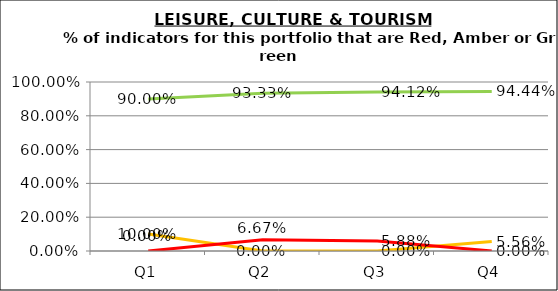
| Category | Green | Amber | Red |
|---|---|---|---|
| Q1 | 0.9 | 0.1 | 0 |
| Q2 | 0.933 | 0 | 0.067 |
| Q3 | 0.941 | 0 | 0.059 |
| Q4 | 0.944 | 0.056 | 0 |